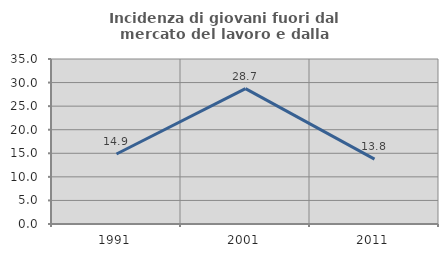
| Category | Incidenza di giovani fuori dal mercato del lavoro e dalla formazione  |
|---|---|
| 1991.0 | 14.855 |
| 2001.0 | 28.723 |
| 2011.0 | 13.768 |